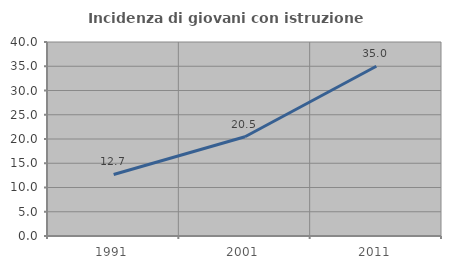
| Category | Incidenza di giovani con istruzione universitaria |
|---|---|
| 1991.0 | 12.689 |
| 2001.0 | 20.473 |
| 2011.0 | 35 |